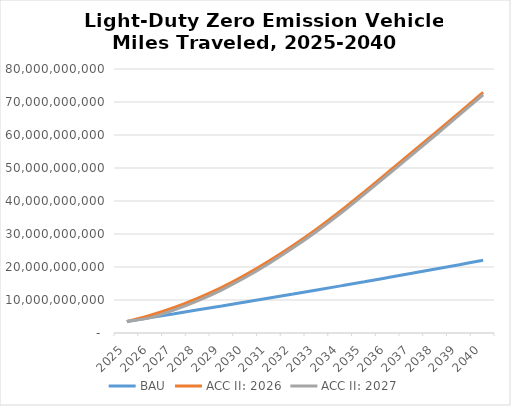
| Category | BAU | ACC II: 2026 | ACC II: 2027 |
|---|---|---|---|
| 2025.0 | 3485043978.174 | 3485043978.174 | 3485043978.174 |
| 2026.0 | 4654494726.421 | 5389110343.135 | 4654494726.421 |
| 2027.0 | 5831769556.962 | 7744203983.079 | 7009690312.204 |
| 2028.0 | 7016749722.123 | 10555925483.515 | 9821512933.691 |
| 2029.0 | 8209336059.433 | 13829777152.243 | 13095463619.08 |
| 2030.0 | 9409409073.528 | 17626974426.362 | 16892758774.882 |
| 2031.0 | 10611637370.179 | 21893506881.006 | 21160079969.549 |
| 2032.0 | 11823905626.574 | 26536762163.067 | 25804113750.998 |
| 2033.0 | 13046296081.979 | 31562897882.494 | 30831015783.672 |
| 2034.0 | 14278813398.028 | 36977925098.095 | 36246799878.157 |
| 2035.0 | 15521549703.771 | 42788097414.615 | 42057717435.42 |
| 2036.0 | 16802426101.473 | 48718789353.576 | 47987741896.797 |
| 2037.0 | 18093650930.769 | 54697978220.835 | 53966272344.783 |
| 2038.0 | 19395222004.377 | 60725619015.594 | 59993262913.519 |
| 2039.0 | 20707088721.825 | 66801518392.303 | 66068521300.809 |
| 2040.0 | 22029255979.069 | 72925656028.713 | 72192026114.01 |